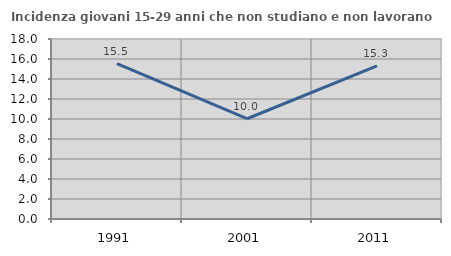
| Category | Incidenza giovani 15-29 anni che non studiano e non lavorano  |
|---|---|
| 1991.0 | 15.533 |
| 2001.0 | 10.026 |
| 2011.0 | 15.306 |